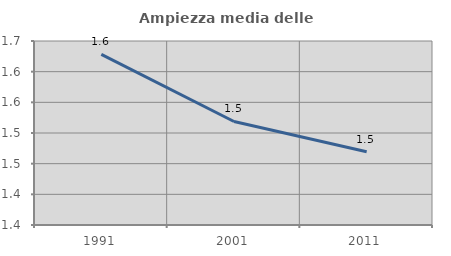
| Category | Ampiezza media delle famiglie |
|---|---|
| 1991.0 | 1.628 |
| 2001.0 | 1.519 |
| 2011.0 | 1.47 |